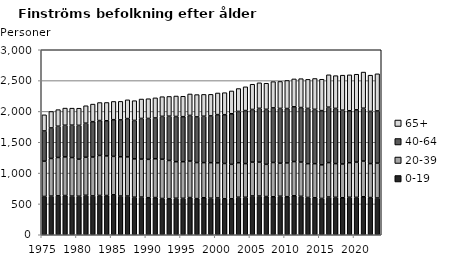
| Category | 0-19 | 20-39 | 40-64 | 65+ |
|---|---|---|---|---|
| 1975.0 | 621 | 572 | 490 | 262 |
| 1976.0 | 627 | 610 | 495 | 267 |
| 1977.0 | 631 | 622 | 507 | 269 |
| 1978.0 | 636 | 627 | 513 | 278 |
| 1979.0 | 627 | 625 | 525 | 276 |
| 1980.0 | 625 | 601 | 548 | 278 |
| 1981.0 | 640 | 617 | 552 | 283 |
| 1982.0 | 630 | 631 | 573 | 285 |
| 1983.0 | 637 | 649 | 566 | 292 |
| 1984.0 | 636 | 643 | 569 | 297 |
| 1985.0 | 648 | 623 | 595 | 296 |
| 1986.0 | 628 | 637 | 598 | 300 |
| 1987.0 | 628 | 635 | 621 | 304 |
| 1988.0 | 609 | 622 | 623 | 320 |
| 1989.0 | 611 | 616 | 659 | 315 |
| 1990.0 | 601 | 622 | 663 | 320 |
| 1991.0 | 603 | 630 | 661 | 326 |
| 1992.0 | 588 | 637 | 695 | 319 |
| 1993.0 | 585 | 620 | 718 | 320 |
| 1994.0 | 592 | 593 | 733 | 332 |
| 1995.0 | 591 | 594 | 730 | 331 |
| 1996.0 | 603 | 592 | 740 | 348 |
| 1997.0 | 586 | 585 | 740 | 362 |
| 1998.0 | 600 | 570 | 752 | 354 |
| 1999.0 | 593 | 576 | 758 | 350 |
| 2000.0 | 597 | 569 | 782 | 351 |
| 2001.0 | 583 | 573 | 791 | 357 |
| 2002.0 | 583 | 559 | 820 | 370 |
| 2003.0 | 609 | 559 | 832 | 371 |
| 2004.0 | 608 | 546 | 860 | 385 |
| 2005.0 | 629 | 549 | 854 | 409 |
| 2006.0 | 628 | 550 | 872 | 414 |
| 2007.0 | 620 | 522 | 892 | 423 |
| 2008.0 | 616 | 556 | 885 | 426 |
| 2009.0 | 625 | 535 | 889 | 437 |
| 2010.0 | 617 | 548 | 882 | 455 |
| 2011.0 | 632 | 555 | 888 | 452 |
| 2012.0 | 623 | 556 | 884 | 468 |
| 2013.0 | 605 | 548 | 896 | 471 |
| 2014.0 | 599 | 554 | 881 | 500 |
| 2015.0 | 589 | 545 | 879 | 509 |
| 2016.0 | 612 | 558 | 899 | 525 |
| 2017.0 | 607 | 547 | 895 | 531 |
| 2018.0 | 600 | 548 | 872 | 568 |
| 2019.0 | 608 | 560 | 843 | 582 |
| 2020.0 | 606 | 572 | 848 | 577 |
| 2021.0 | 616 | 579 | 857 | 586 |
| 2022.0 | 603 | 551 | 846 | 588 |
| 2023.0 | 596 | 566 | 846 | 602 |